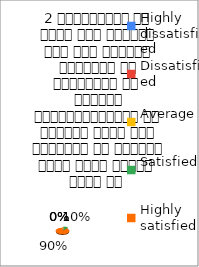
| Category | 2 व्याख्यान से रूचि में वृद्धि हुई एवं शिक्षण जानकारी से परिपूर्ण था 
शिक्षक विद्यार्थियों के द्वारा पूछे गये प्रश्नो का समाधान करने हेतु तत्पर  रहते है  |
|---|---|
| Highly dissatisfied | 0 |
| Dissatisfied | 0 |
| Average | 0 |
| Satisfied | 3 |
| Highly satisfied | 26 |